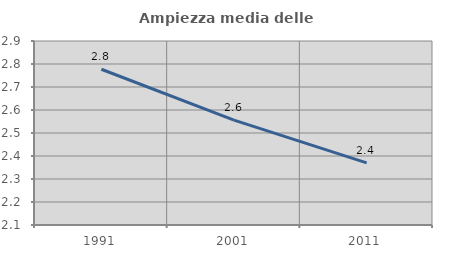
| Category | Ampiezza media delle famiglie |
|---|---|
| 1991.0 | 2.777 |
| 2001.0 | 2.556 |
| 2011.0 | 2.37 |